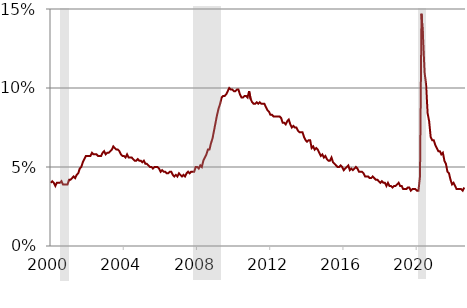
| Category | Series 0 |
|---|---|
| 2000-01-01 | 0.04 |
| 2000-02-01 | 0.041 |
| 2000-03-01 | 0.04 |
| 2000-04-01 | 0.038 |
| 2000-05-01 | 0.04 |
| 2000-06-01 | 0.04 |
| 2000-07-01 | 0.04 |
| 2000-08-01 | 0.041 |
| 2000-09-01 | 0.039 |
| 2000-10-01 | 0.039 |
| 2000-11-01 | 0.039 |
| 2000-12-01 | 0.039 |
| 2001-01-01 | 0.042 |
| 2001-02-01 | 0.042 |
| 2001-03-01 | 0.043 |
| 2001-04-01 | 0.044 |
| 2001-05-01 | 0.043 |
| 2001-06-01 | 0.045 |
| 2001-07-01 | 0.046 |
| 2001-08-01 | 0.049 |
| 2001-09-01 | 0.05 |
| 2001-10-01 | 0.053 |
| 2001-11-01 | 0.055 |
| 2001-12-01 | 0.057 |
| 2002-01-01 | 0.057 |
| 2002-02-01 | 0.057 |
| 2002-03-01 | 0.057 |
| 2002-04-01 | 0.059 |
| 2002-05-01 | 0.058 |
| 2002-06-01 | 0.058 |
| 2002-07-01 | 0.058 |
| 2002-08-01 | 0.057 |
| 2002-09-01 | 0.057 |
| 2002-10-01 | 0.057 |
| 2002-11-01 | 0.059 |
| 2002-12-01 | 0.06 |
| 2003-01-01 | 0.058 |
| 2003-02-01 | 0.059 |
| 2003-03-01 | 0.059 |
| 2003-04-01 | 0.06 |
| 2003-05-01 | 0.061 |
| 2003-06-01 | 0.063 |
| 2003-07-01 | 0.062 |
| 2003-08-01 | 0.061 |
| 2003-09-01 | 0.061 |
| 2003-10-01 | 0.06 |
| 2003-11-01 | 0.058 |
| 2003-12-01 | 0.057 |
| 2004-01-01 | 0.057 |
| 2004-02-01 | 0.056 |
| 2004-03-01 | 0.058 |
| 2004-04-01 | 0.056 |
| 2004-05-01 | 0.056 |
| 2004-06-01 | 0.056 |
| 2004-07-01 | 0.055 |
| 2004-08-01 | 0.054 |
| 2004-09-01 | 0.054 |
| 2004-10-01 | 0.055 |
| 2004-11-01 | 0.054 |
| 2004-12-01 | 0.054 |
| 2005-01-01 | 0.053 |
| 2005-02-01 | 0.054 |
| 2005-03-01 | 0.052 |
| 2005-04-01 | 0.052 |
| 2005-05-01 | 0.051 |
| 2005-06-01 | 0.05 |
| 2005-07-01 | 0.05 |
| 2005-08-01 | 0.049 |
| 2005-09-01 | 0.05 |
| 2005-10-01 | 0.05 |
| 2005-11-01 | 0.05 |
| 2005-12-01 | 0.049 |
| 2006-01-01 | 0.047 |
| 2006-02-01 | 0.048 |
| 2006-03-01 | 0.047 |
| 2006-04-01 | 0.047 |
| 2006-05-01 | 0.046 |
| 2006-06-01 | 0.046 |
| 2006-07-01 | 0.047 |
| 2006-08-01 | 0.047 |
| 2006-09-01 | 0.045 |
| 2006-10-01 | 0.044 |
| 2006-11-01 | 0.045 |
| 2006-12-01 | 0.044 |
| 2007-01-01 | 0.046 |
| 2007-02-01 | 0.045 |
| 2007-03-01 | 0.044 |
| 2007-04-01 | 0.045 |
| 2007-05-01 | 0.044 |
| 2007-06-01 | 0.046 |
| 2007-07-01 | 0.047 |
| 2007-08-01 | 0.046 |
| 2007-09-01 | 0.047 |
| 2007-10-01 | 0.047 |
| 2007-11-01 | 0.047 |
| 2007-12-01 | 0.05 |
| 2008-01-01 | 0.05 |
| 2008-02-01 | 0.049 |
| 2008-03-01 | 0.051 |
| 2008-04-01 | 0.05 |
| 2008-05-01 | 0.054 |
| 2008-06-01 | 0.056 |
| 2008-07-01 | 0.058 |
| 2008-08-01 | 0.061 |
| 2008-09-01 | 0.061 |
| 2008-10-01 | 0.065 |
| 2008-11-01 | 0.068 |
| 2008-12-01 | 0.073 |
| 2009-01-01 | 0.078 |
| 2009-02-01 | 0.083 |
| 2009-03-01 | 0.087 |
| 2009-04-01 | 0.09 |
| 2009-05-01 | 0.094 |
| 2009-06-01 | 0.095 |
| 2009-07-01 | 0.095 |
| 2009-08-01 | 0.096 |
| 2009-09-01 | 0.098 |
| 2009-10-01 | 0.1 |
| 2009-11-01 | 0.099 |
| 2009-12-01 | 0.099 |
| 2010-01-01 | 0.098 |
| 2010-02-01 | 0.098 |
| 2010-03-01 | 0.099 |
| 2010-04-01 | 0.099 |
| 2010-05-01 | 0.096 |
| 2010-06-01 | 0.094 |
| 2010-07-01 | 0.094 |
| 2010-08-01 | 0.095 |
| 2010-09-01 | 0.095 |
| 2010-10-01 | 0.094 |
| 2010-11-01 | 0.098 |
| 2010-12-01 | 0.093 |
| 2011-01-01 | 0.091 |
| 2011-02-01 | 0.09 |
| 2011-03-01 | 0.09 |
| 2011-04-01 | 0.091 |
| 2011-05-01 | 0.09 |
| 2011-06-01 | 0.091 |
| 2011-07-01 | 0.09 |
| 2011-08-01 | 0.09 |
| 2011-09-01 | 0.09 |
| 2011-10-01 | 0.088 |
| 2011-11-01 | 0.086 |
| 2011-12-01 | 0.085 |
| 2012-01-01 | 0.083 |
| 2012-02-01 | 0.083 |
| 2012-03-01 | 0.082 |
| 2012-04-01 | 0.082 |
| 2012-05-01 | 0.082 |
| 2012-06-01 | 0.082 |
| 2012-07-01 | 0.082 |
| 2012-08-01 | 0.081 |
| 2012-09-01 | 0.078 |
| 2012-10-01 | 0.078 |
| 2012-11-01 | 0.077 |
| 2012-12-01 | 0.079 |
| 2013-01-01 | 0.08 |
| 2013-02-01 | 0.077 |
| 2013-03-01 | 0.075 |
| 2013-04-01 | 0.076 |
| 2013-05-01 | 0.075 |
| 2013-06-01 | 0.075 |
| 2013-07-01 | 0.073 |
| 2013-08-01 | 0.072 |
| 2013-09-01 | 0.072 |
| 2013-10-01 | 0.072 |
| 2013-11-01 | 0.069 |
| 2013-12-01 | 0.067 |
| 2014-01-01 | 0.066 |
| 2014-02-01 | 0.067 |
| 2014-03-01 | 0.067 |
| 2014-04-01 | 0.062 |
| 2014-05-01 | 0.063 |
| 2014-06-01 | 0.061 |
| 2014-07-01 | 0.062 |
| 2014-08-01 | 0.061 |
| 2014-09-01 | 0.059 |
| 2014-10-01 | 0.057 |
| 2014-11-01 | 0.058 |
| 2014-12-01 | 0.056 |
| 2015-01-01 | 0.057 |
| 2015-02-01 | 0.055 |
| 2015-03-01 | 0.054 |
| 2015-04-01 | 0.054 |
| 2015-05-01 | 0.056 |
| 2015-06-01 | 0.053 |
| 2015-07-01 | 0.052 |
| 2015-08-01 | 0.051 |
| 2015-09-01 | 0.05 |
| 2015-10-01 | 0.05 |
| 2015-11-01 | 0.051 |
| 2015-12-01 | 0.05 |
| 2016-01-01 | 0.048 |
| 2016-02-01 | 0.049 |
| 2016-03-01 | 0.05 |
| 2016-04-01 | 0.051 |
| 2016-05-01 | 0.048 |
| 2016-06-01 | 0.049 |
| 2016-07-01 | 0.048 |
| 2016-08-01 | 0.049 |
| 2016-09-01 | 0.05 |
| 2016-10-01 | 0.049 |
| 2016-11-01 | 0.047 |
| 2016-12-01 | 0.047 |
| 2017-01-01 | 0.047 |
| 2017-02-01 | 0.046 |
| 2017-03-01 | 0.044 |
| 2017-04-01 | 0.044 |
| 2017-05-01 | 0.044 |
| 2017-06-01 | 0.043 |
| 2017-07-01 | 0.043 |
| 2017-08-01 | 0.044 |
| 2017-09-01 | 0.043 |
| 2017-10-01 | 0.042 |
| 2017-11-01 | 0.042 |
| 2017-12-01 | 0.041 |
| 2018-01-01 | 0.04 |
| 2018-02-01 | 0.041 |
| 2018-03-01 | 0.04 |
| 2018-04-01 | 0.04 |
| 2018-05-01 | 0.038 |
| 2018-06-01 | 0.04 |
| 2018-07-01 | 0.038 |
| 2018-08-01 | 0.038 |
| 2018-09-01 | 0.037 |
| 2018-10-01 | 0.038 |
| 2018-11-01 | 0.038 |
| 2018-12-01 | 0.039 |
| 2019-01-01 | 0.04 |
| 2019-02-01 | 0.038 |
| 2019-03-01 | 0.038 |
| 2019-04-01 | 0.036 |
| 2019-05-01 | 0.036 |
| 2019-06-01 | 0.036 |
| 2019-07-01 | 0.037 |
| 2019-08-01 | 0.037 |
| 2019-09-01 | 0.035 |
| 2019-10-01 | 0.036 |
| 2019-11-01 | 0.036 |
| 2019-12-01 | 0.036 |
| 2020-01-01 | 0.035 |
| 2020-02-01 | 0.035 |
| 2020-03-01 | 0.044 |
| 2020-04-01 | 0.147 |
| 2020-05-01 | 0.132 |
| 2020-06-01 | 0.11 |
| 2020-07-01 | 0.102 |
| 2020-08-01 | 0.084 |
| 2020-09-01 | 0.079 |
| 2020-10-01 | 0.069 |
| 2020-11-01 | 0.067 |
| 2020-12-01 | 0.067 |
| 2021-01-01 | 0.064 |
| 2021-02-01 | 0.062 |
| 2021-03-01 | 0.06 |
| 2021-04-01 | 0.06 |
| 2021-05-01 | 0.058 |
| 2021-06-01 | 0.059 |
| 2021-07-01 | 0.054 |
| 2021-08-01 | 0.052 |
| 2021-09-01 | 0.047 |
| 2021-10-01 | 0.046 |
| 2021-11-01 | 0.042 |
| 2021-12-01 | 0.039 |
| 2022-01-01 | 0.04 |
| 2022-02-01 | 0.038 |
| 2022-03-01 | 0.036 |
| 2022-04-01 | 0.036 |
| 2022-05-01 | 0.036 |
| 2022-06-01 | 0.036 |
| 2022-07-01 | 0.035 |
| 2022-08-01 | 0.037 |